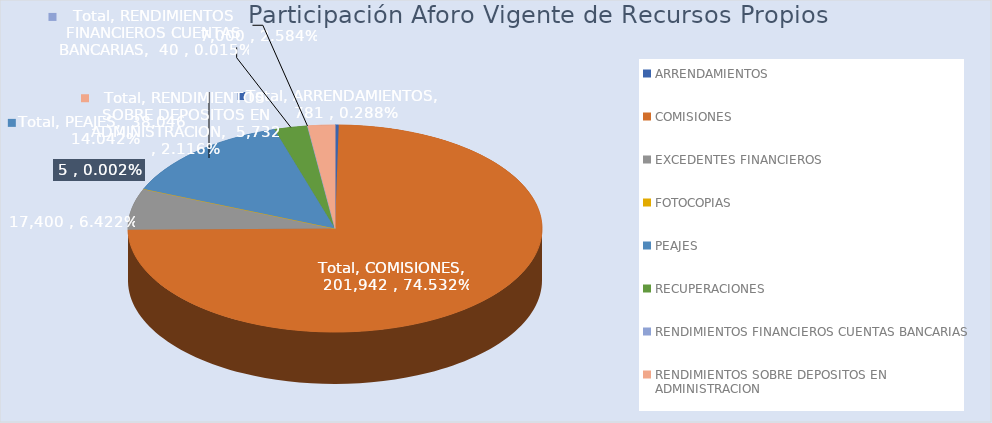
| Category | Total |
|---|---|
| ARRENDAMIENTOS | 781 |
| COMISIONES | 201941.704 |
| EXCEDENTES FINANCIEROS | 17400 |
| FOTOCOPIAS | 5 |
| PEAJES | 38046 |
| RECUPERACIONES | 7000 |
| RENDIMIENTOS FINANCIEROS CUENTAS BANCARIAS | 40 |
| RENDIMIENTOS SOBRE DEPOSITOS EN ADMINISTRACION | 5732.039 |